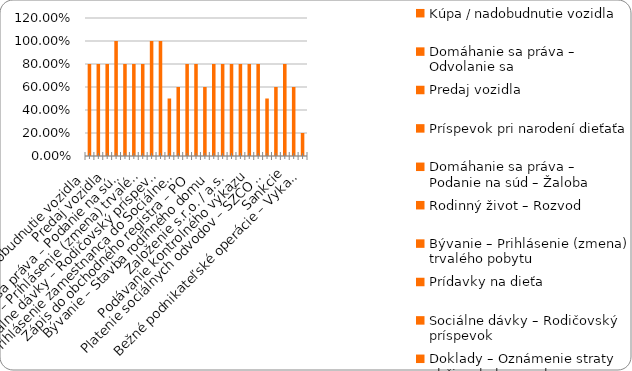
| Category | % |
|---|---|
| Kúpa / nadobudnutie vozidla | 0.8 |
| Domáhanie sa práva – Odvolanie sa | 0.8 |
| Predaj vozidla | 0.8 |
| Príspevok pri narodení dieťaťa | 1 |
| Domáhanie sa práva – Podanie na súd – Žaloba | 0.8 |
| Rodinný život – Rozvod | 0.8 |
| Bývanie – Prihlásenie (zmena) trvalého pobytu | 0.8 |
| Prídavky na dieťa | 1 |
| Sociálne dávky – Rodičovský príspevok | 1 |
| Doklady – Oznámenie straty občianskeho preukazu | 0.5 |
| Prihlásenie zamestnanca do Sociálnej poisťovne | 0.6 |
| Plnenie si daňových povinností – zamestnanec (FO) | 0.8 |
| Zápis do obchodného registra – PO | 0.8 |
| Živnosť - ukončenie | 0.6 |
| Bývanie – Stavba rodinného domu | 0.8 |
| Sociálne dávky – Príspevok v nezamestnanosti | 0.8 |
| Založenie s.r.o. / a.s. | 0.8 |
| Živnosť – založenie | 0.8 |
| Podávanie kontrolného výkazu | 0.8 |
| Plnenie si daňových povinností – SZČO / PO  | 0.8 |
| Platenie sociálnych odvodov – SZČO / PO | 0.5 |
| Živnosť - prerušenie | 0.6 |
| Sankcie | 0.8 |
| Živnosť - zmena | 0.6 |
| Bežné podnikateľské operácie – Vykazovanie štatistík | 0.2 |